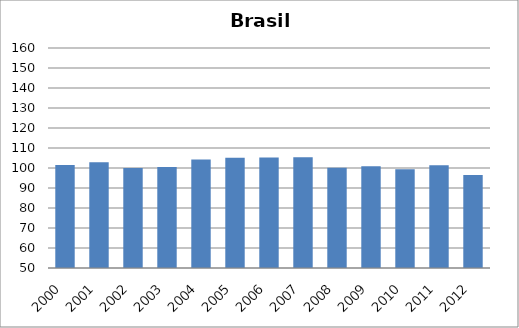
| Category | Poliomielite |
|---|---|
| 2000.0 | 101.44 |
| 2001.0 | 102.83 |
| 2002.0 | 100.01 |
| 2003.0 | 100.48 |
| 2004.0 | 104.3 |
| 2005.0 | 105.12 |
| 2006.0 | 105.25 |
| 2007.0 | 105.43 |
| 2008.0 | 100.18 |
| 2009.0 | 100.92 |
| 2010.0 | 99.35 |
| 2011.0 | 101.33 |
| 2012.0 | 96.55 |